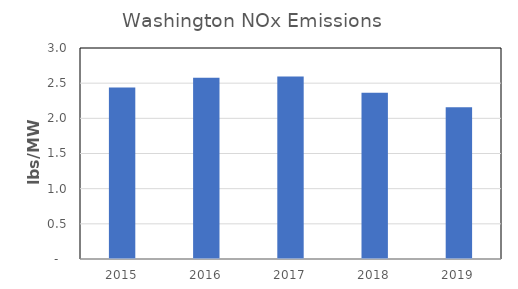
| Category | Series 0 |
|---|---|
| 2015.0 | 2.438 |
| 2016.0 | 2.575 |
| 2017.0 | 2.595 |
| 2018.0 | 2.365 |
| 2019.0 | 2.158 |